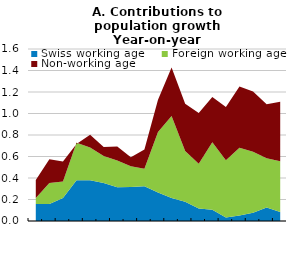
| Category | Swiss working age | Foreign working age | Non-working age |
|---|---|---|---|
|  | 0.157 | 0.056 | 0.169 |
|  | 0.159 | 0.194 | 0.222 |
|  | 0.214 | 0.154 | 0.185 |
|  | 0.38 | 0.347 | -0.011 |
|  | 0.38 | 0.303 | 0.119 |
|  | 0.354 | 0.251 | 0.082 |
|  | 0.314 | 0.249 | 0.128 |
|  | 0.317 | 0.193 | 0.084 |
|  | 0.324 | 0.162 | 0.179 |
|  | 0.265 | 0.563 | 0.301 |
|  | 0.215 | 0.761 | 0.451 |
|  | 0.179 | 0.473 | 0.438 |
|  | 0.116 | 0.416 | 0.473 |
|  | 0.106 | 0.626 | 0.421 |
|  | 0.033 | 0.533 | 0.496 |
|  | 0.052 | 0.629 | 0.57 |
|  | 0.076 | 0.569 | 0.559 |
|  | 0.125 | 0.46 | 0.501 |
|  | 0.084 | 0.471 | 0.555 |